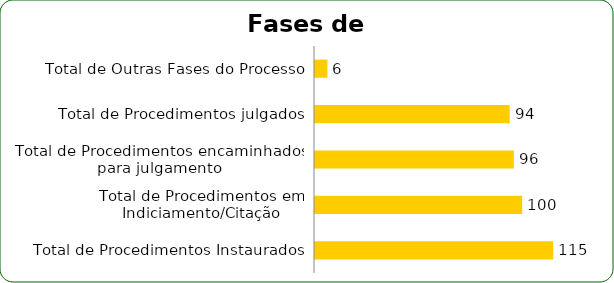
| Category | Series 0 |
|---|---|
| Total de Procedimentos Instaurados | 115 |
| Total de Procedimentos em Indiciamento/Citação | 100 |
| Total de Procedimentos encaminhados para julgamento | 96 |
| Total de Procedimentos julgados | 94 |
| Total de Outras Fases do Processo | 6 |